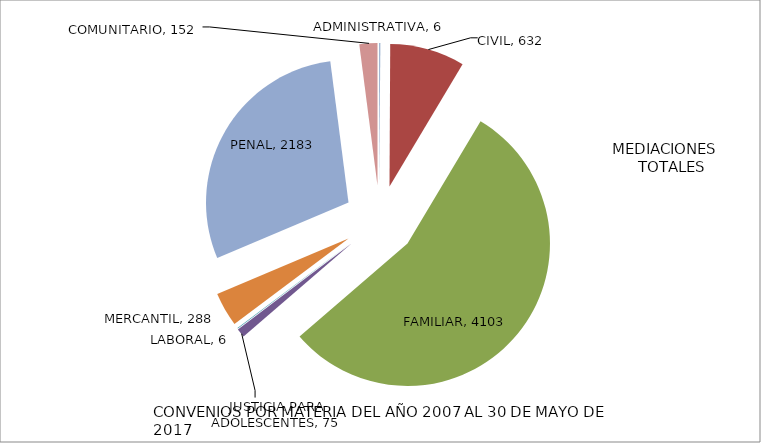
| Category | Series 0 |
|---|---|
| ADMINISTRATIVA | 6 |
| CIVIL | 632 |
| FAMILIAR | 4103 |
| JUSTICIA PARA ADOLESCENTES | 75 |
| LABORAL | 6 |
| MERCANTIL | 288 |
| PENAL | 2183 |
| COMUNITARIO | 152 |